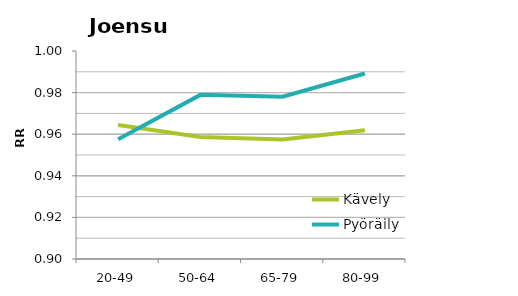
| Category | Kävely | Pyöräily |
|---|---|---|
| 20-49 | 0.964 | 0.958 |
| 50-64 | 0.959 | 0.979 |
| 65-79 | 0.957 | 0.978 |
| 80-99 | 0.962 | 0.989 |